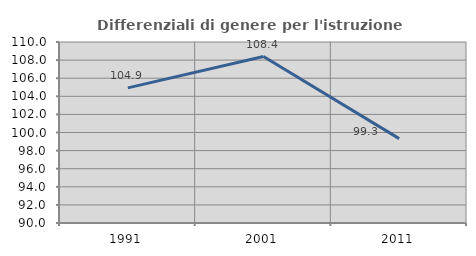
| Category | Differenziali di genere per l'istruzione superiore |
|---|---|
| 1991.0 | 104.929 |
| 2001.0 | 108.396 |
| 2011.0 | 99.32 |